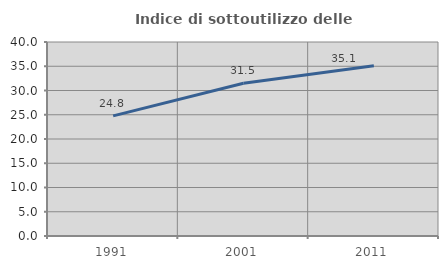
| Category | Indice di sottoutilizzo delle abitazioni  |
|---|---|
| 1991.0 | 24.769 |
| 2001.0 | 31.48 |
| 2011.0 | 35.084 |